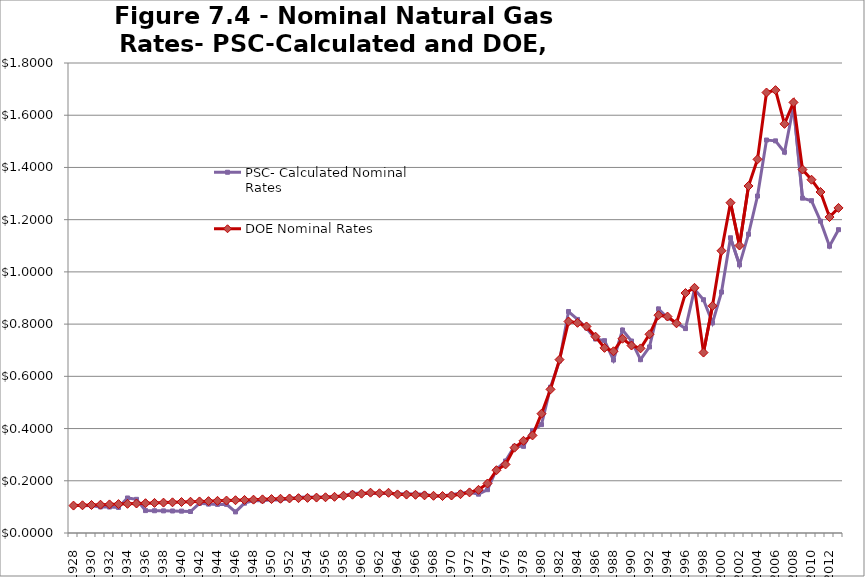
| Category | PSC- Calculated Nominal Rates | DOE Nominal Rates |
|---|---|---|
| 1928.0 | 0.105 | 0.105 |
| 1929.0 | 0.105 | 0.106 |
| 1930.0 | 0.104 | 0.107 |
| 1931.0 | 0.1 | 0.108 |
| 1932.0 | 0.099 | 0.11 |
| 1933.0 | 0.098 | 0.111 |
| 1934.0 | 0.134 | 0.112 |
| 1935.0 | 0.129 | 0.113 |
| 1936.0 | 0.086 | 0.114 |
| 1937.0 | 0.085 | 0.115 |
| 1938.0 | 0.085 | 0.116 |
| 1939.0 | 0.084 | 0.117 |
| 1940.0 | 0.084 | 0.119 |
| 1941.0 | 0.082 | 0.12 |
| 1942.0 | 0.113 | 0.121 |
| 1943.0 | 0.111 | 0.122 |
| 1944.0 | 0.11 | 0.123 |
| 1945.0 | 0.11 | 0.124 |
| 1946.0 | 0.081 | 0.125 |
| 1947.0 | 0.114 | 0.127 |
| 1948.0 | 0.124 | 0.128 |
| 1949.0 | 0.123 | 0.129 |
| 1950.0 | 0.127 | 0.13 |
| 1951.0 | 0.127 | 0.131 |
| 1952.0 | 0.131 | 0.132 |
| 1953.0 | 0.137 | 0.133 |
| 1954.0 | 0.138 | 0.135 |
| 1955.0 | 0.137 | 0.136 |
| 1956.0 | 0.138 | 0.137 |
| 1957.0 | 0.138 | 0.139 |
| 1958.0 | 0.142 | 0.143 |
| 1959.0 | 0.152 | 0.147 |
| 1960.0 | 0.152 | 0.151 |
| 1961.0 | 0.152 | 0.154 |
| 1962.0 | 0.151 | 0.152 |
| 1963.0 | 0.151 | 0.154 |
| 1964.0 | 0.151 | 0.148 |
| 1965.0 | 0.15 | 0.147 |
| 1966.0 | 0.15 | 0.146 |
| 1967.0 | 0.149 | 0.144 |
| 1968.0 | 0.141 | 0.142 |
| 1969.0 | 0.143 | 0.142 |
| 1970.0 | 0.147 | 0.144 |
| 1971.0 | 0.154 | 0.149 |
| 1972.0 | 0.156 | 0.156 |
| 1973.0 | 0.149 | 0.165 |
| 1974.0 | 0.166 | 0.19 |
| 1975.0 | 0.244 | 0.24 |
| 1976.0 | 0.276 | 0.262 |
| 1977.0 | 0.332 | 0.327 |
| 1978.0 | 0.332 | 0.353 |
| 1979.0 | 0.393 | 0.374 |
| 1980.0 | 0.415 | 0.457 |
| 1981.0 | 0.559 | 0.55 |
| 1982.0 | 0.659 | 0.664 |
| 1983.0 | 0.848 | 0.81 |
| 1984.0 | 0.818 | 0.805 |
| 1985.0 | 0.785 | 0.791 |
| 1986.0 | 0.743 | 0.752 |
| 1987.0 | 0.737 | 0.709 |
| 1988.0 | 0.663 | 0.696 |
| 1989.0 | 0.777 | 0.744 |
| 1990.0 | 0.735 | 0.718 |
| 1991.0 | 0.664 | 0.707 |
| 1992.0 | 0.713 | 0.761 |
| 1993.0 | 0.858 | 0.834 |
| 1994.0 | 0.824 | 0.829 |
| 1995.0 | 0.805 | 0.803 |
| 1996.0 | 0.783 | 0.919 |
| 1997.0 | 0.933 | 0.939 |
| 1998.0 | 0.893 | 0.691 |
| 1999.0 | 0.805 | 0.87 |
| 2000.0 | 0.923 | 1.081 |
| 2001.0 | 1.131 | 1.265 |
| 2002.0 | 1.027 | 1.101 |
| 2003.0 | 1.144 | 1.329 |
| 2004.0 | 1.29 | 1.431 |
| 2005.0 | 1.505 | 1.687 |
| 2006.0 | 1.502 | 1.696 |
| 2007.0 | 1.458 | 1.567 |
| 2008.0 | 1.635 | 1.649 |
| 2009.0 | 1.282 | 1.392 |
| 2010.0 | 1.273 | 1.353 |
| 2011.0 | 1.194 | 1.306 |
| 2012.0 | 1.098 | 1.21 |
| 2013.0 | 1.162 | 1.245 |